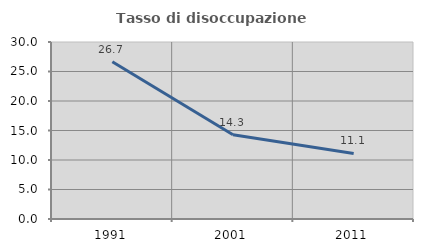
| Category | Tasso di disoccupazione giovanile  |
|---|---|
| 1991.0 | 26.667 |
| 2001.0 | 14.286 |
| 2011.0 | 11.111 |